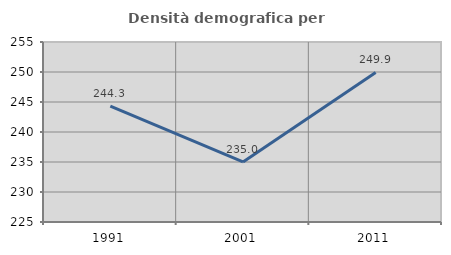
| Category | Densità demografica |
|---|---|
| 1991.0 | 244.33 |
| 2001.0 | 235.013 |
| 2011.0 | 249.92 |